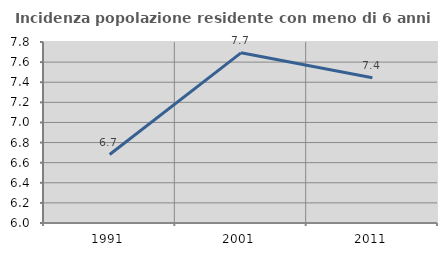
| Category | Incidenza popolazione residente con meno di 6 anni |
|---|---|
| 1991.0 | 6.681 |
| 2001.0 | 7.692 |
| 2011.0 | 7.445 |